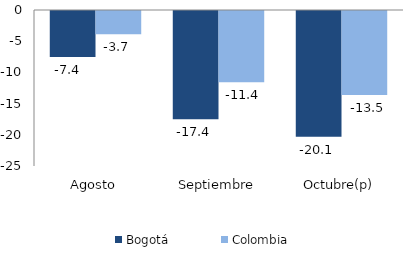
| Category | Bogotá | Colombia |
|---|---|---|
| Agosto | -7.381 | -3.728 |
| Septiembre | -17.363 | -11.424 |
| Octubre(p) | -20.148 | -13.456 |